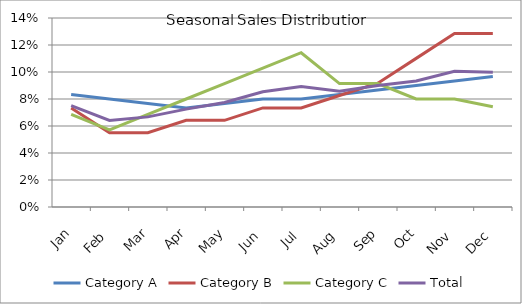
| Category | Category A | Category B | Category C | Total |
|---|---|---|---|---|
| 2016-01-16 | 0.083 | 0.073 | 0.069 | 0.075 |
| 2016-02-16 | 0.08 | 0.055 | 0.057 | 0.064 |
| 2016-03-16 | 0.077 | 0.055 | 0.069 | 0.067 |
| 2016-04-16 | 0.073 | 0.064 | 0.08 | 0.073 |
| 2016-05-16 | 0.077 | 0.064 | 0.091 | 0.077 |
| 2016-06-16 | 0.08 | 0.073 | 0.103 | 0.085 |
| 2016-07-16 | 0.08 | 0.073 | 0.114 | 0.089 |
| 2016-08-16 | 0.083 | 0.083 | 0.091 | 0.086 |
| 2016-09-16 | 0.087 | 0.092 | 0.091 | 0.09 |
| 2016-10-16 | 0.09 | 0.11 | 0.08 | 0.093 |
| 2016-11-16 | 0.093 | 0.128 | 0.08 | 0.101 |
| 2016-12-16 | 0.097 | 0.128 | 0.074 | 0.1 |